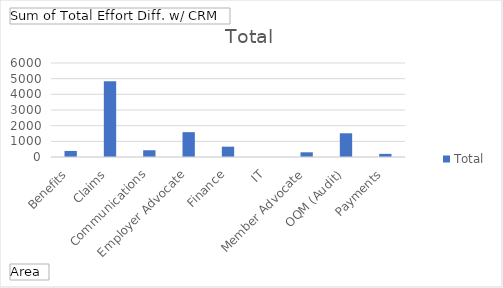
| Category | Total |
|---|---|
| Benefits | 387.177 |
| Claims | 4827.713 |
| Communications | 431.288 |
| Employer Advocate | 1585.218 |
| Finance | 658.938 |
| IT | 0 |
| Member Advocate | 300.008 |
| OQM (Audit) | 1514.344 |
| Payments | 200.172 |